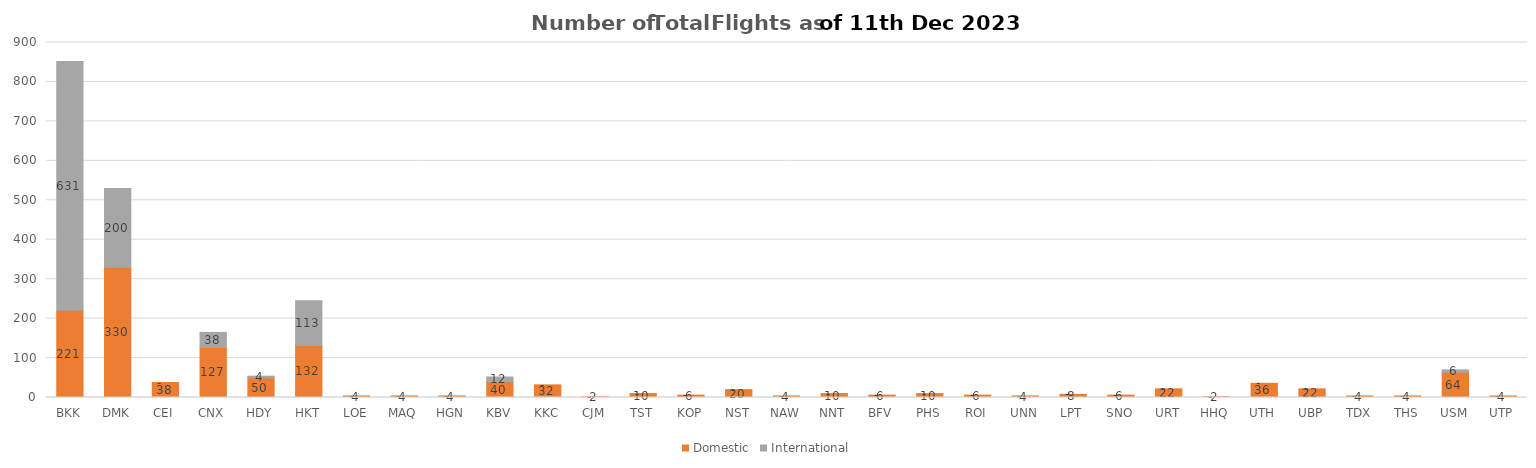
| Category | Domestic | International |
|---|---|---|
| BKK | 221 | 631 |
| DMK | 330 | 200 |
| CEI | 38 | 0 |
| CNX | 127 | 38 |
| HDY | 50 | 4 |
| HKT | 132 | 113 |
| LOE | 4 | 0 |
| MAQ | 4 | 0 |
| HGN | 4 | 0 |
| KBV | 40 | 12 |
| KKC | 32 | 0 |
| CJM | 2 | 0 |
| TST | 10 | 0 |
| KOP | 6 | 0 |
| NST | 20 | 0 |
| NAW | 4 | 0 |
| NNT | 10 | 0 |
| BFV | 6 | 0 |
| PHS | 10 | 0 |
| ROI | 6 | 0 |
| UNN | 4 | 0 |
| LPT | 8 | 0 |
| SNO | 6 | 0 |
| URT | 22 | 0 |
| HHQ | 2 | 0 |
| UTH | 36 | 0 |
| UBP | 22 | 0 |
| TDX | 4 | 0 |
| THS | 4 | 0 |
| USM | 64 | 6 |
| UTP | 4 | 0 |